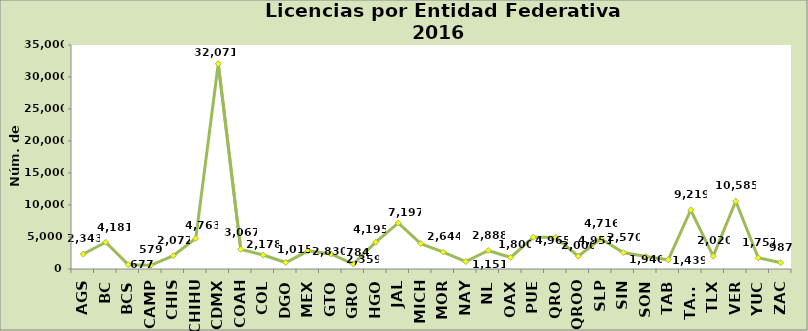
| Category | Series 0 |
|---|---|
| AGS | 2343 |
| BC | 4181 |
| BCS | 677 |
| CAMP | 579 |
| CHIS | 2072 |
| CHIHU | 4763 |
| CDMX | 32071 |
| COAH | 3067 |
| COL | 2178 |
| DGO | 1015 |
| MEX | 2830 |
| GTO | 2359 |
| GRO | 784 |
| HGO | 4195 |
| JAL | 7197 |
| MICH | 3972 |
| MOR | 2644 |
| NAY | 1151 |
| NL | 2888 |
| OAX | 1800 |
| PUE | 4965 |
| QRO | 4951 |
| QROO | 2000 |
| SLP | 4716 |
| SIN | 2570 |
| SON | 1940 |
| TAB | 1439 |
| TAMS | 9219 |
| TLX | 2020 |
| VER | 10585 |
| YUC | 1757 |
| ZAC | 987 |